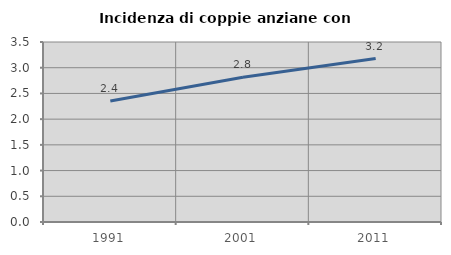
| Category | Incidenza di coppie anziane con figli |
|---|---|
| 1991.0 | 2.352 |
| 2001.0 | 2.816 |
| 2011.0 | 3.178 |